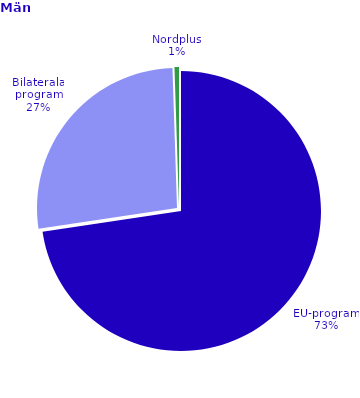
| Category | Series 0 |
|---|---|
| EU-program | 3928 |
| Bilaterala program | 1451 |
| Nordplus | 28 |